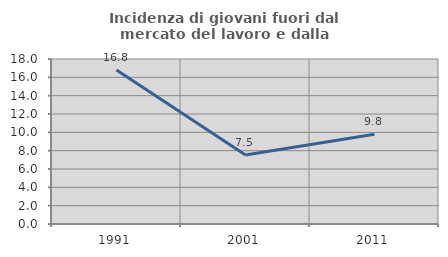
| Category | Incidenza di giovani fuori dal mercato del lavoro e dalla formazione  |
|---|---|
| 1991.0 | 16.811 |
| 2001.0 | 7.531 |
| 2011.0 | 9.793 |